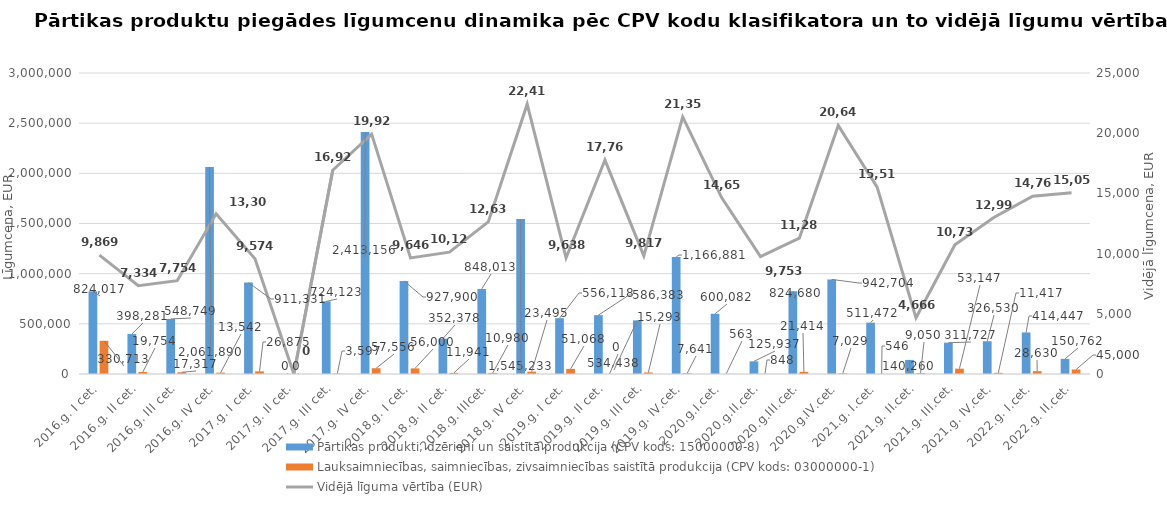
| Category | Pārtikas produkti, dzērieni un saistītā produkcija (CPV kods: 15000000-8) | Lauksaimniecības, saimniecības, zivsaimniecības saistītā produkcija (CPV kods: 03000000-1) |
|---|---|---|
| 2016.g. I cet. | 824017 | 330713 |
| 2016.g. II cet. | 398281 | 19754 |
| 2016.g. III cet. | 548749.01 | 17317 |
| 2016.g. IV cet. | 2061890 | 13542 |
| 2017.g. I cet. | 911330.81 | 26874.91 |
| 2017.g. II cet. | 0 | 0 |
| 2017.g. III cet. | 724123.07 | 3596.6 |
| 2017.g. IV cet. | 2413156 | 57556 |
| 2018.g. I cet. | 927900 | 56000 |
| 2018.g. II cet. | 352378 | 11941 |
| 2018.g. IIIcet. | 848013 | 10980 |
| 2018.g. IV cet. | 1545233 | 23495 |
| 2019.g. I cet. | 556118 | 51068 |
| 2019.g. II cet. | 586383 | 0 |
| 2019.g. III cet. | 534438 | 15293 |
| 2019.g. IV.cet. | 1166881 | 7641 |
| 2020.g.I.cet. | 600082 | 563 |
| 2020.g.II.cet. | 125937 | 848 |
| 2020.g.III.cet. | 824680 | 21414 |
| 2020.g.IV.cet. | 942704 | 7029 |
| 2021.g. I.cet. | 511472 | 546 |
| 2021.g. II.cet. | 140260 | 9050 |
| 2021.g. III.cet. | 311727 | 53147 |
| 2021.g. IV.cet. | 326530 | 11417 |
| 2022.g. I.cet. | 414447 | 28630 |
| 2022.g. II.cet. | 150762 | 45000 |